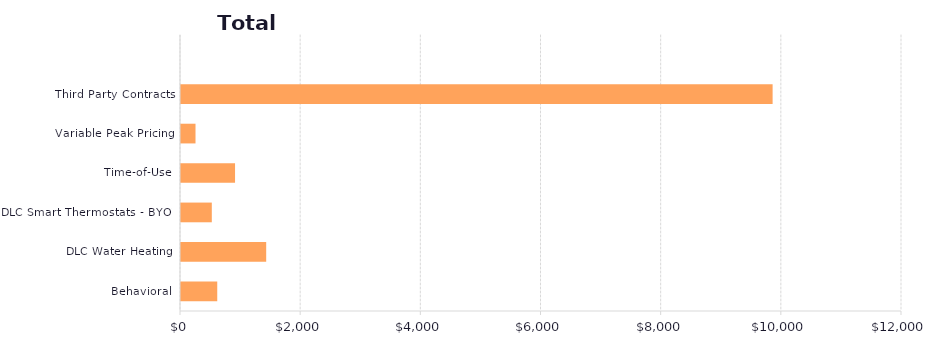
| Category | Series 1 |
|---|---|
| Behavioral | 603.218 |
| DLC Water Heating | 1417.911 |
| DLC Smart Thermostats - BYOT | 512.716 |
| Time-of-Use | 899.503 |
| Variable Peak Pricing | 241.471 |
| Third Party Contracts | 9846.575 |